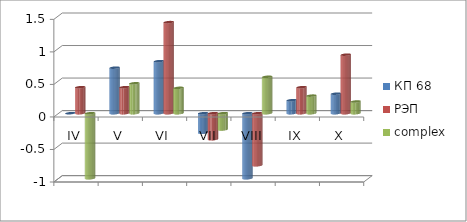
| Category | КП 68 | РЭП  | complex |
|---|---|---|---|
| IV | 0 | 0.4 | -1 |
| V | 0.7 | 0.4 | 0.46 |
| VI | 0.8 | 1.4 | 0.39 |
| VII | -0.3 | -0.4 | -0.25 |
| VIII | -1 | -0.8 | 0.56 |
| IX | 0.2 | 0.4 | 0.27 |
| X | 0.3 | 0.9 | 0.18 |